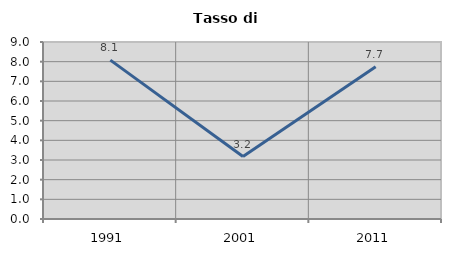
| Category | Tasso di disoccupazione   |
|---|---|
| 1991.0 | 8.08 |
| 2001.0 | 3.176 |
| 2011.0 | 7.739 |